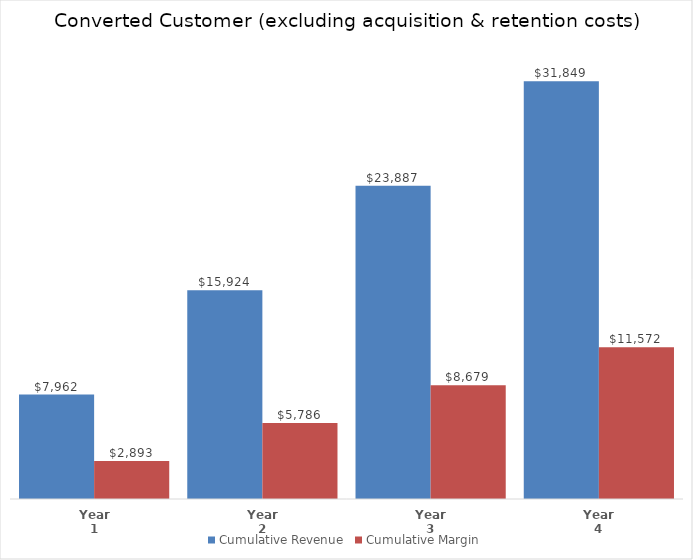
| Category | Cumulative Revenue | Cumulative Margin |
|---|---|---|
| Year 1 | 7962.24 | 2892.947 |
| Year 2 | 15924.48 | 5785.894 |
| Year 3 | 23886.72 | 8678.842 |
| Year 4 | 31848.96 | 11571.789 |